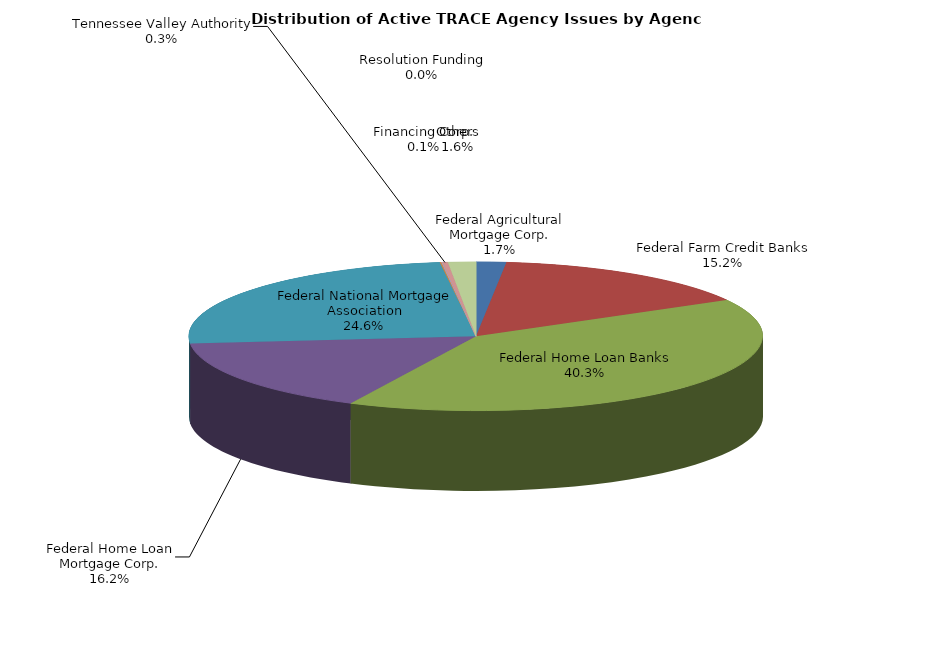
| Category | Series 0 |
|---|---|
| Federal Agricultural Mortgage Corp. | 271 |
| Federal Farm Credit Banks | 2445 |
| Federal Home Loan Banks | 6483 |
| Federal Home Loan Mortgage Corp. | 2613 |
| Federal National Mortgage Association | 3951 |
| Financing Corp. | 14 |
| Resolution Funding | 6 |
| Tennessee Valley Authority | 51 |
| Others | 252 |